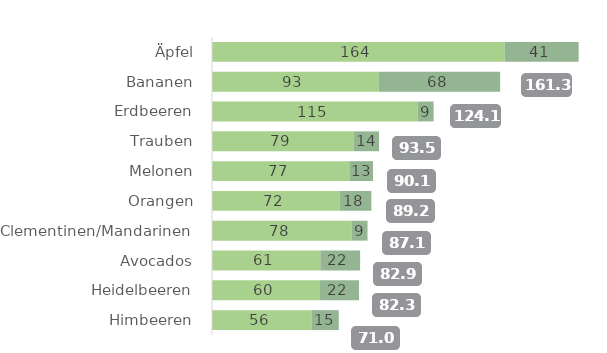
| Category | nicht Bio | Bio |
|---|---|---|
| Äpfel | 163.865 | 41.381 |
| Bananen | 93.403 | 67.907 |
| Erdbeeren | 115.209 | 8.858 |
| Trauben | 79.475 | 14.036 |
| Melonen | 76.872 | 13.259 |
| Orangen | 71.553 | 17.662 |
| Clementinen/Mandarinen | 78.324 | 8.731 |
| Avocados | 60.63 | 22.292 |
| Heidelbeeren | 60.468 | 21.826 |
| Himbeeren | 55.898 | 15.067 |